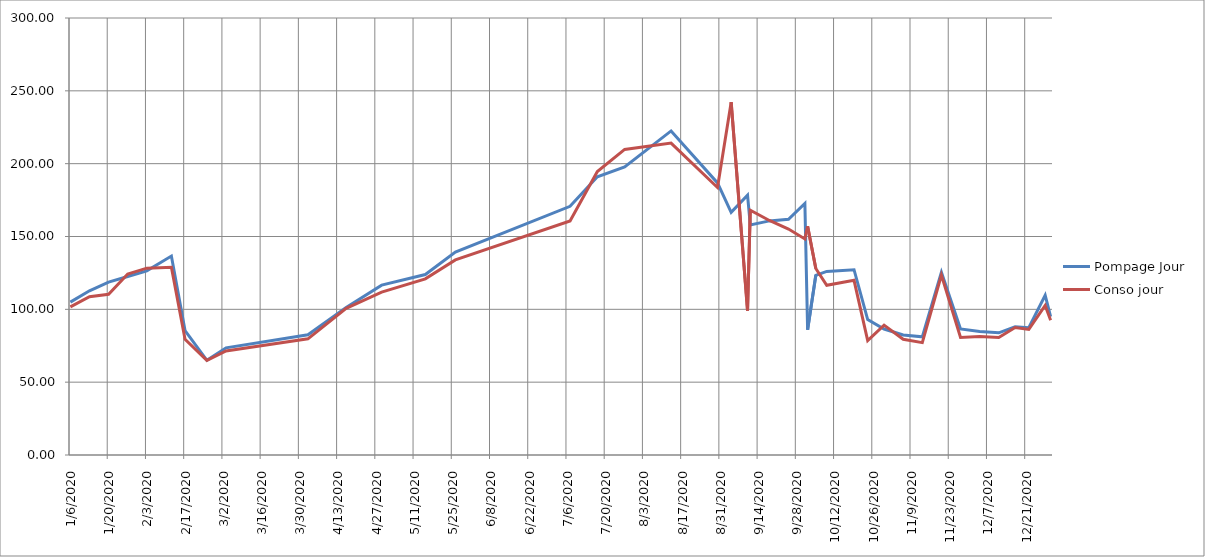
| Category | Pompage Jour | Conso jour |
|---|---|---|
| 06/01/2020 | 104.952 | 101.667 |
| 13/01/2020 | 112.714 | 108.714 |
| 20/01/2020 | 118.714 | 110.286 |
| 27/01/2020 | 122.571 | 124.286 |
| 03/02/2020 | 126.429 | 128.286 |
| 12/02/2020 | 136.556 | 128.889 |
| 17/02/2020 | 85.4 | 79.4 |
| 25/02/2020 | 65 | 65 |
| 03/03/2020 | 73.571 | 71.429 |
| 02/04/2020 | 82.533 | 79.767 |
| 16/04/2020 | 101.286 | 100.714 |
| 29/04/2020 | 116.615 | 111.846 |
| 15/05/2020 | 123.875 | 120.938 |
| 26/05/2020 | 139.364 | 133.909 |
| 07/07/2020 | 170.738 | 160.714 |
| 17/07/2020 | 191 | 194.6 |
| 27/07/2020 | 197.7 | 209.8 |
| 13/08/2020 | 222.471 | 214.118 |
| 30/08/2020 | 186.765 | 183.647 |
| 04/09/2020 | 166.6 | 242.2 |
| 10/09/2020 | 178.333 | 99.167 |
| 11/09/2020 | 158 | 168 |
| 18/09/2020 | 160.714 | 161 |
| 25/09/2020 | 161.857 | 155.143 |
| 01/10/2020 | 172.667 | 148.333 |
| 02/10/2020 | 86 | 157 |
| 05/10/2020 | 123.333 | 128 |
| 09/10/2020 | 126 | 116.5 |
| 19/10/2020 | 127.2 | 119.9 |
| 24/10/2020 | 93 | 78.6 |
| 30/10/2020 | 86.5 | 89.167 |
| 06/11/2020 | 82.429 | 79.429 |
| 13/11/2020 | 81.143 | 77.143 |
| 20/11/2020 | 125.429 | 123.571 |
| 27/11/2020 | 86.571 | 80.714 |
| 04/12/2020 | 84.857 | 81.429 |
| 11/12/2020 | 83.857 | 80.714 |
| 17/12/2020 | 88 | 87.5 |
| 22/12/2020 | 87.4 | 86.2 |
| 28/12/2020 | 109.667 | 102.667 |
| 30/12/2020 | 95 | 92.5 |